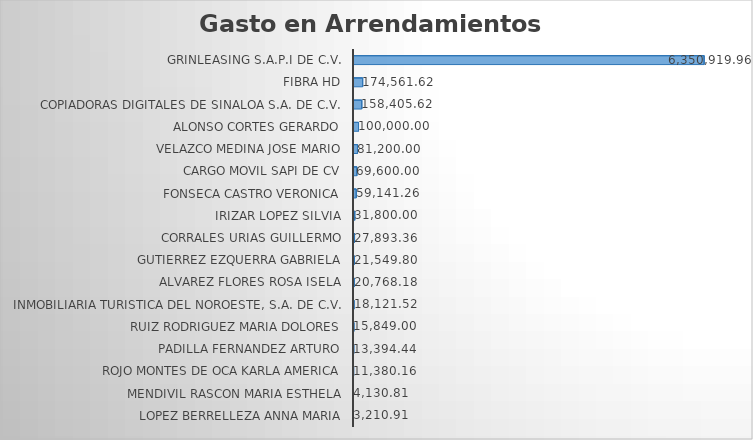
| Category | Suma |
|---|---|
| LOPEZ BERRELLEZA ANNA MARIA | 3210.91 |
| MENDIVIL RASCON MARIA ESTHELA | 4130.81 |
| ROJO MONTES DE OCA KARLA AMERICA | 11380.16 |
| PADILLA FERNANDEZ ARTURO | 13394.44 |
| RUIZ RODRIGUEZ MARIA DOLORES | 15849 |
| INMOBILIARIA TURISTICA DEL NOROESTE, S.A. DE C.V. | 18121.52 |
| ALVAREZ FLORES ROSA ISELA | 20768.18 |
| GUTIERREZ EZQUERRA GABRIELA | 21549.8 |
| CORRALES URIAS GUILLERMO | 27893.36 |
| IRIZAR LOPEZ SILVIA | 31800 |
| FONSECA CASTRO VERONICA | 59141.26 |
| CARGO MOVIL SAPI DE CV | 69600 |
| VELAZCO MEDINA JOSE MARIO | 81200 |
| ALONSO CORTES GERARDO | 100000 |
| COPIADORAS DIGITALES DE SINALOA S.A. DE C.V. | 158405.62 |
| FIBRA HD | 174561.62 |
| GRINLEASING S.A.P.I DE C.V. | 6350919.96 |